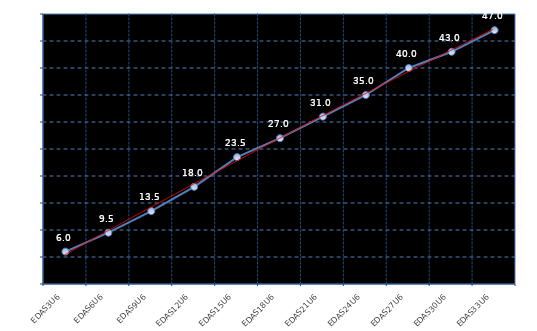
| Category | Series 0 |
|---|---|
| EDAS3U6 | 6 |
| EDAS6U6 | 9.5 |
| EDAS9U6 | 13.5 |
| EDAS12U6 | 18 |
| EDAS15U6 | 23.5 |
| EDAS18U6 | 27 |
| EDAS21U6 | 31 |
| EDAS24U6 | 35 |
| EDAS27U6 | 40 |
| EDAS30U6 | 43 |
| EDAS33U6 | 47 |